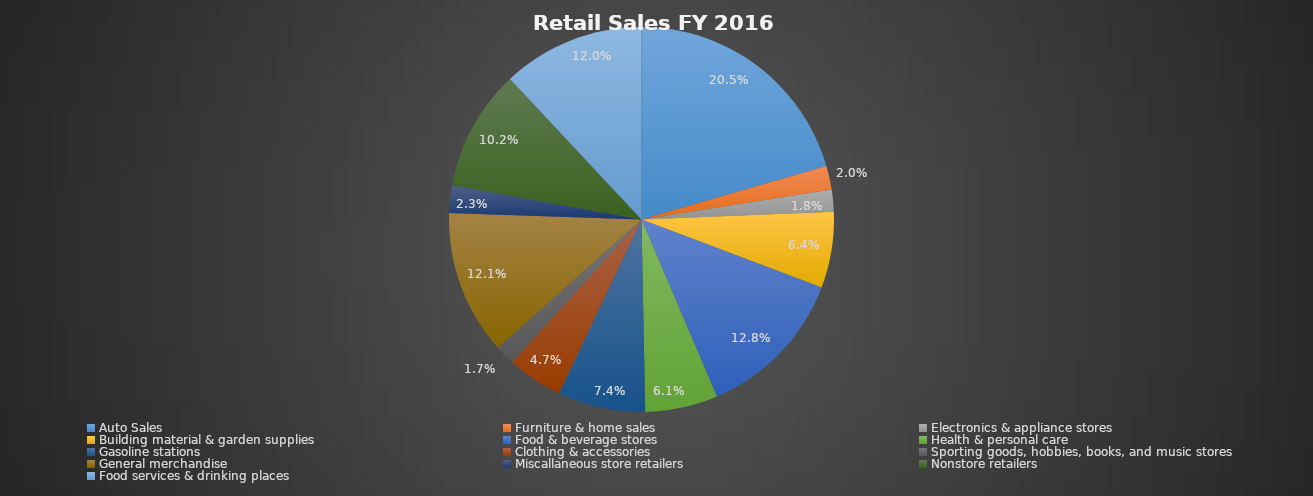
| Category | Series 0 |
|---|---|
| Auto Sales | 0.205 |
| Furniture & home sales | 0.02 |
| Electronics & appliance stores | 0.018 |
| Building material & garden supplies | 0.064 |
| Food & beverage stores | 0.128 |
| Health & personal care | 0.061 |
| Gasoline stations | 0.074 |
| Clothing & accessories  | 0.047 |
| Sporting goods, hobbies, books, and music stores | 0.017 |
| General merchandise | 0.121 |
| Miscallaneous store retailers | 0.023 |
| Nonstore retailers | 0.102 |
| Food services & drinking places | 0.12 |